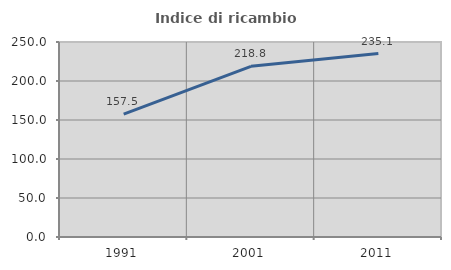
| Category | Indice di ricambio occupazionale  |
|---|---|
| 1991.0 | 157.499 |
| 2001.0 | 218.815 |
| 2011.0 | 235.135 |